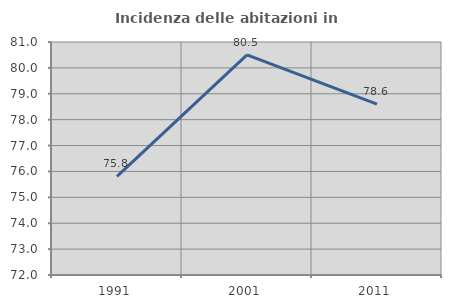
| Category | Incidenza delle abitazioni in proprietà  |
|---|---|
| 1991.0 | 75.806 |
| 2001.0 | 80.502 |
| 2011.0 | 78.598 |